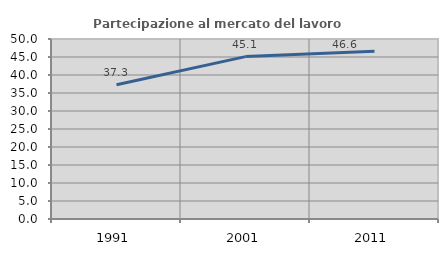
| Category | Partecipazione al mercato del lavoro  femminile |
|---|---|
| 1991.0 | 37.304 |
| 2001.0 | 45.105 |
| 2011.0 | 46.612 |